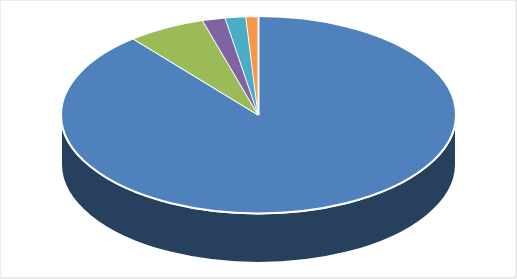
| Category | Series 0 |
|---|---|
|      RECLAMAÇÃO | 0.801 |
|      SOLICITAÇÃO | 0 |
|      DENÚNCIA | 0.057 |
|      ELOGIO | 0.017 |
|      LAI | 0.015 |
|      SUGESTÃO | 0.009 |